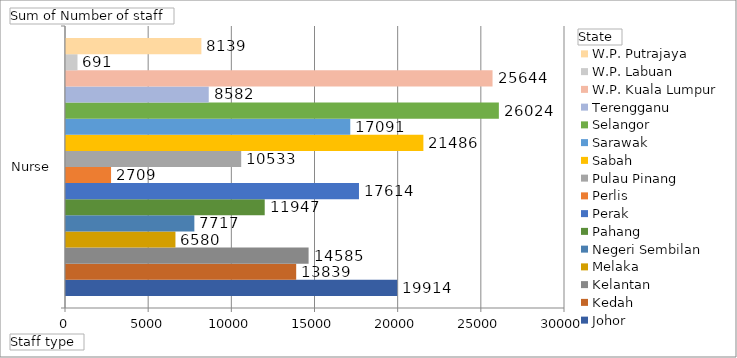
| Category | Johor | Kedah | Kelantan | Melaka | Negeri Sembilan | Pahang | Perak | Perlis | Pulau Pinang | Sabah | Sarawak | Selangor | Terengganu | W.P. Kuala Lumpur | W.P. Labuan | W.P. Putrajaya |
|---|---|---|---|---|---|---|---|---|---|---|---|---|---|---|---|---|
| Nurse | 19914 | 13839 | 14585 | 6580 | 7717 | 11947 | 17614 | 2709 | 10533 | 21486 | 17091 | 26024 | 8582 | 25644 | 691 | 8139 |